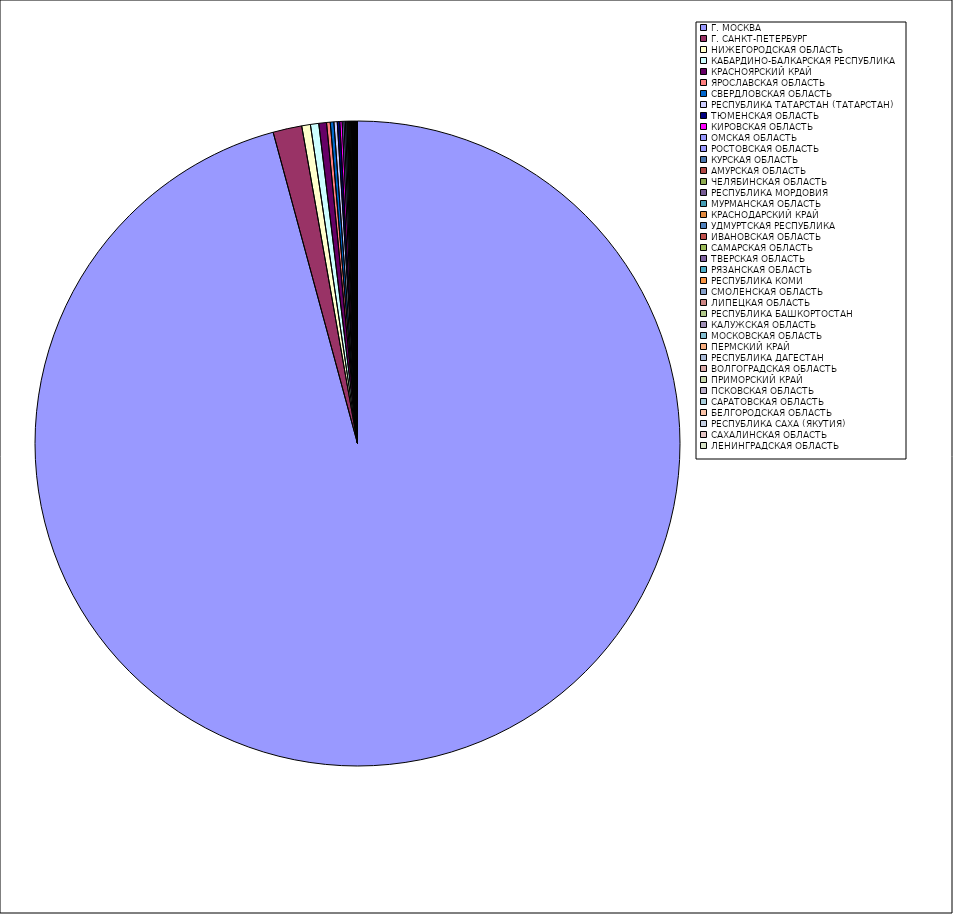
| Category | Оборот |
|---|---|
| Г. МОСКВА | 95.756 |
| Г. САНКТ-ПЕТЕРБУРГ | 1.443 |
| НИЖЕГОРОДСКАЯ ОБЛАСТЬ | 0.435 |
| КАБАРДИНО-БАЛКАРСКАЯ РЕСПУБЛИКА | 0.415 |
| КРАСНОЯРСКИЙ КРАЙ | 0.387 |
| ЯРОСЛАВСКАЯ ОБЛАСТЬ | 0.184 |
| СВЕРДЛОВСКАЯ ОБЛАСТЬ | 0.18 |
| РЕСПУБЛИКА ТАТАРСТАН (ТАТАРСТАН) | 0.166 |
| ТЮМЕНСКАЯ ОБЛАСТЬ | 0.124 |
| КИРОВСКАЯ ОБЛАСТЬ | 0.119 |
| ОМСКАЯ ОБЛАСТЬ | 0.088 |
| РОСТОВСКАЯ ОБЛАСТЬ | 0.073 |
| КУРСКАЯ ОБЛАСТЬ | 0.067 |
| АМУРСКАЯ ОБЛАСТЬ | 0.049 |
| ЧЕЛЯБИНСКАЯ ОБЛАСТЬ | 0.048 |
| РЕСПУБЛИКА МОРДОВИЯ | 0.046 |
| МУРМАНСКАЯ ОБЛАСТЬ | 0.045 |
| КРАСНОДАРСКИЙ КРАЙ | 0.04 |
| УДМУРТСКАЯ РЕСПУБЛИКА | 0.038 |
| ИВАНОВСКАЯ ОБЛАСТЬ | 0.029 |
| САМАРСКАЯ ОБЛАСТЬ | 0.023 |
| ТВЕРСКАЯ ОБЛАСТЬ | 0.021 |
| РЯЗАНСКАЯ ОБЛАСТЬ | 0.02 |
| РЕСПУБЛИКА КОМИ | 0.018 |
| СМОЛЕНСКАЯ ОБЛАСТЬ | 0.016 |
| ЛИПЕЦКАЯ ОБЛАСТЬ | 0.014 |
| РЕСПУБЛИКА БАШКОРТОСТАН | 0.014 |
| КАЛУЖСКАЯ ОБЛАСТЬ | 0.013 |
| МОСКОВСКАЯ ОБЛАСТЬ | 0.013 |
| ПЕРМСКИЙ КРАЙ | 0.012 |
| РЕСПУБЛИКА ДАГЕСТАН | 0.011 |
| ВОЛГОГРАДСКАЯ ОБЛАСТЬ | 0.01 |
| ПРИМОРСКИЙ КРАЙ | 0.008 |
| ПСКОВСКАЯ ОБЛАСТЬ | 0.008 |
| САРАТОВСКАЯ ОБЛАСТЬ | 0.008 |
| БЕЛГОРОДСКАЯ ОБЛАСТЬ | 0.007 |
| РЕСПУБЛИКА САХА (ЯКУТИЯ) | 0.006 |
| САХАЛИНСКАЯ ОБЛАСТЬ | 0.005 |
| ЛЕНИНГРАДСКАЯ ОБЛАСТЬ | 0.005 |